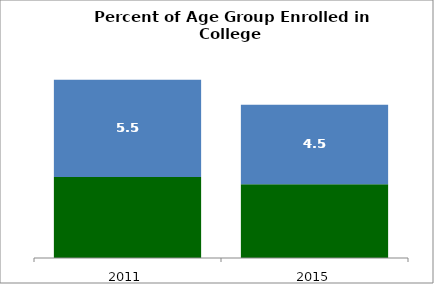
| Category | 18 to 24 | 25 to 49 |
|---|---|---|
| 2011.0 | 32.6 | 5.538 |
| 2015.0 | 32.2 | 4.522 |